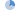
| Category | Series 0 |
|---|---|
| 0 | 30 |
| 1 | 70 |